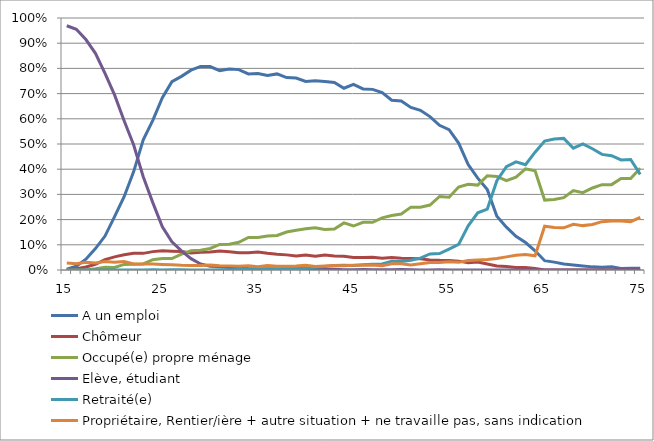
| Category | A un emploi | Chômeur | Occupé(e) propre ménage | Elève, étudiant | Retraité(e) | Propriétaire, Rentier/ière + autre situation + ne travaille pas, sans indication |
|---|---|---|---|---|---|---|
| 15.0 | 0.003 | 0 | 0 | 0.969 | 0 | 0.028 |
| 16.0 | 0.015 | 0.005 | 0 | 0.955 | 0 | 0.025 |
| 17.0 | 0.043 | 0.012 | 0 | 0.914 | 0 | 0.031 |
| 18.0 | 0.085 | 0.023 | 0.005 | 0.86 | 0 | 0.027 |
| 19.0 | 0.135 | 0.042 | 0.01 | 0.78 | 0 | 0.033 |
| 20.0 | 0.212 | 0.052 | 0.01 | 0.695 | 0 | 0.031 |
| 21.0 | 0.291 | 0.061 | 0.022 | 0.592 | 0 | 0.034 |
| 22.0 | 0.391 | 0.067 | 0.022 | 0.496 | 0 | 0.024 |
| 23.0 | 0.516 | 0.066 | 0.024 | 0.37 | 0 | 0.023 |
| 24.0 | 0.594 | 0.073 | 0.041 | 0.267 | 0.001 | 0.023 |
| 25.0 | 0.684 | 0.077 | 0.045 | 0.172 | 0 | 0.022 |
| 26.0 | 0.747 | 0.075 | 0.045 | 0.112 | 0.001 | 0.02 |
| 27.0 | 0.768 | 0.073 | 0.063 | 0.076 | 0.001 | 0.019 |
| 28.0 | 0.793 | 0.068 | 0.076 | 0.045 | 0 | 0.018 |
| 29.0 | 0.808 | 0.071 | 0.079 | 0.024 | 0 | 0.018 |
| 30.0 | 0.808 | 0.072 | 0.086 | 0.015 | 0 | 0.02 |
| 31.0 | 0.791 | 0.075 | 0.101 | 0.013 | 0.001 | 0.017 |
| 32.0 | 0.798 | 0.073 | 0.102 | 0.01 | 0.001 | 0.016 |
| 33.0 | 0.795 | 0.069 | 0.11 | 0.009 | 0.002 | 0.015 |
| 34.0 | 0.778 | 0.068 | 0.129 | 0.006 | 0.002 | 0.017 |
| 35.0 | 0.78 | 0.072 | 0.129 | 0.004 | 0.003 | 0.013 |
| 36.0 | 0.772 | 0.066 | 0.135 | 0.004 | 0.005 | 0.018 |
| 37.0 | 0.778 | 0.062 | 0.137 | 0.003 | 0.005 | 0.015 |
| 38.0 | 0.764 | 0.06 | 0.151 | 0.004 | 0.007 | 0.015 |
| 39.0 | 0.762 | 0.056 | 0.157 | 0.003 | 0.006 | 0.016 |
| 40.0 | 0.748 | 0.06 | 0.163 | 0.002 | 0.008 | 0.019 |
| 41.0 | 0.751 | 0.054 | 0.167 | 0.002 | 0.011 | 0.014 |
| 42.0 | 0.748 | 0.059 | 0.161 | 0.002 | 0.014 | 0.016 |
| 43.0 | 0.744 | 0.055 | 0.163 | 0.003 | 0.017 | 0.017 |
| 44.0 | 0.721 | 0.054 | 0.187 | 0.001 | 0.019 | 0.017 |
| 45.0 | 0.737 | 0.05 | 0.174 | 0.001 | 0.018 | 0.019 |
| 46.0 | 0.718 | 0.05 | 0.189 | 0.002 | 0.021 | 0.019 |
| 47.0 | 0.717 | 0.05 | 0.189 | 0.001 | 0.023 | 0.02 |
| 48.0 | 0.704 | 0.047 | 0.207 | 0.001 | 0.024 | 0.017 |
| 49.0 | 0.674 | 0.05 | 0.216 | 0.001 | 0.035 | 0.024 |
| 50.0 | 0.671 | 0.047 | 0.222 | 0.002 | 0.034 | 0.025 |
| 51.0 | 0.645 | 0.045 | 0.249 | 0.001 | 0.039 | 0.02 |
| 52.0 | 0.634 | 0.044 | 0.249 | 0 | 0.047 | 0.025 |
| 53.0 | 0.609 | 0.04 | 0.258 | 0 | 0.064 | 0.03 |
| 54.0 | 0.574 | 0.038 | 0.292 | 0.001 | 0.065 | 0.03 |
| 55.0 | 0.557 | 0.038 | 0.289 | 0 | 0.083 | 0.033 |
| 56.0 | 0.504 | 0.035 | 0.329 | 0 | 0.101 | 0.03 |
| 57.0 | 0.418 | 0.028 | 0.34 | 0 | 0.175 | 0.038 |
| 58.0 | 0.365 | 0.031 | 0.337 | 0 | 0.227 | 0.04 |
| 59.0 | 0.319 | 0.024 | 0.374 | 0 | 0.242 | 0.042 |
| 60.0 | 0.213 | 0.016 | 0.371 | 0 | 0.354 | 0.045 |
| 61.0 | 0.17 | 0.014 | 0.354 | 0 | 0.41 | 0.052 |
| 62.0 | 0.134 | 0.01 | 0.369 | 0 | 0.429 | 0.058 |
| 63.0 | 0.109 | 0.01 | 0.401 | 0 | 0.418 | 0.062 |
| 64.0 | 0.076 | 0.006 | 0.394 | 0 | 0.468 | 0.056 |
| 65.0 | 0.037 | 0 | 0.277 | 0 | 0.512 | 0.174 |
| 66.0 | 0.031 | 0 | 0.28 | 0 | 0.52 | 0.169 |
| 67.0 | 0.024 | 0 | 0.287 | 0 | 0.522 | 0.167 |
| 68.0 | 0.02 | 0 | 0.315 | 0 | 0.483 | 0.182 |
| 69.0 | 0.016 | 0 | 0.307 | 0 | 0.501 | 0.176 |
| 70.0 | 0.012 | 0 | 0.325 | 0 | 0.481 | 0.181 |
| 71.0 | 0.011 | 0 | 0.339 | 0 | 0.459 | 0.192 |
| 72.0 | 0.013 | 0 | 0.339 | 0 | 0.453 | 0.195 |
| 73.0 | 0.006 | 0 | 0.363 | 0 | 0.437 | 0.194 |
| 74.0 | 0.007 | 0 | 0.363 | 0 | 0.439 | 0.192 |
| 75.0 | 0.007 | 0 | 0.404 | 0 | 0.38 | 0.209 |